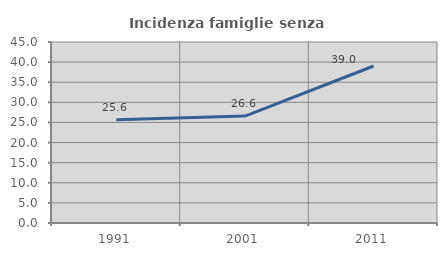
| Category | Incidenza famiglie senza nuclei |
|---|---|
| 1991.0 | 25.645 |
| 2001.0 | 26.587 |
| 2011.0 | 39.032 |